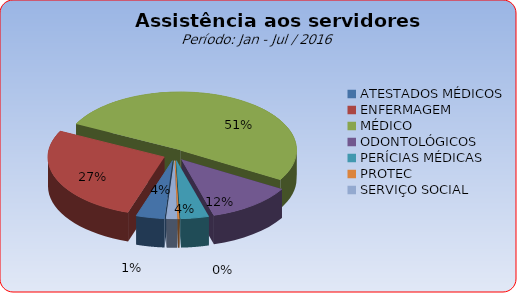
| Category | Series 0 |
|---|---|
| ATESTADOS MÉDICOS | 3.936 |
| ENFERMAGEM | 27.325 |
| MÉDICO | 51.129 |
| ODONTOLÓGICOS | 12.036 |
| PERÍCIAS MÉDICAS | 3.874 |
| PROTEC | 0.207 |
| SERVIÇO SOCIAL | 1.492 |